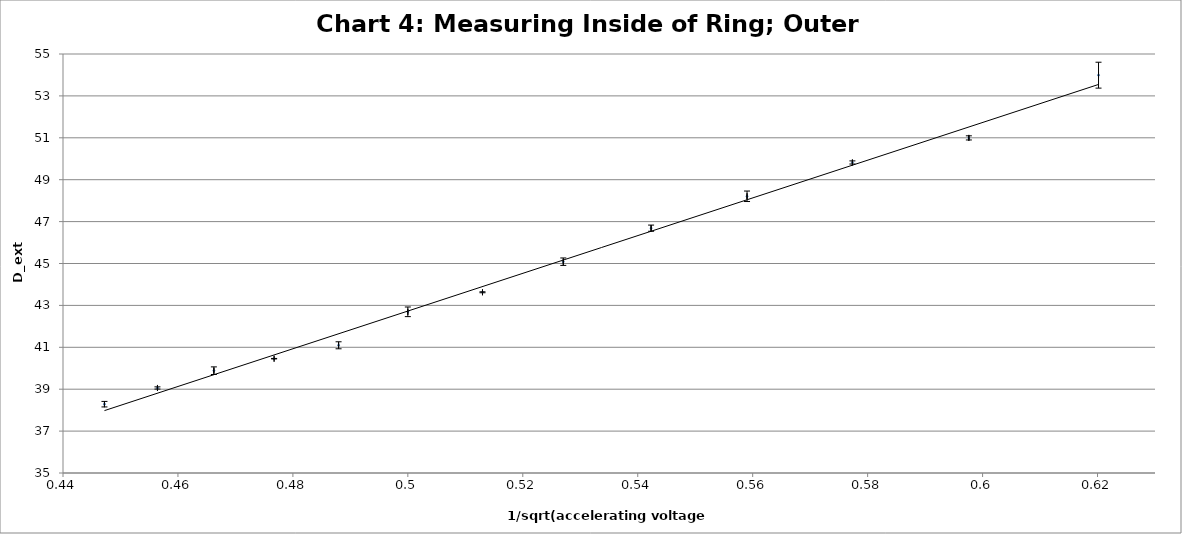
| Category | Series 0 |
|---|---|
| 0.4472135954999579 | 38.285 |
| 0.45643546458763845 | 39.059 |
| 0.4662524041201569 | 39.883 |
| 0.4767312946227961 | 40.457 |
| 0.48795003647426655 | 41.097 |
| 0.5 | 42.694 |
| 0.5129891760425771 | 43.627 |
| 0.5270462766947299 | 45.086 |
| 0.5423261445466404 | 46.686 |
| 0.5590169943749475 | 48.208 |
| 0.5773502691896258 | 49.823 |
| 0.5976143046671968 | 50.996 |
| 0.6201736729460422 | 53.99 |